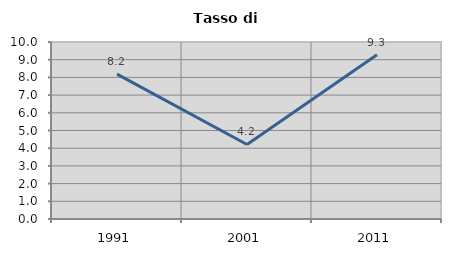
| Category | Tasso di disoccupazione   |
|---|---|
| 1991.0 | 8.187 |
| 2001.0 | 4.212 |
| 2011.0 | 9.276 |